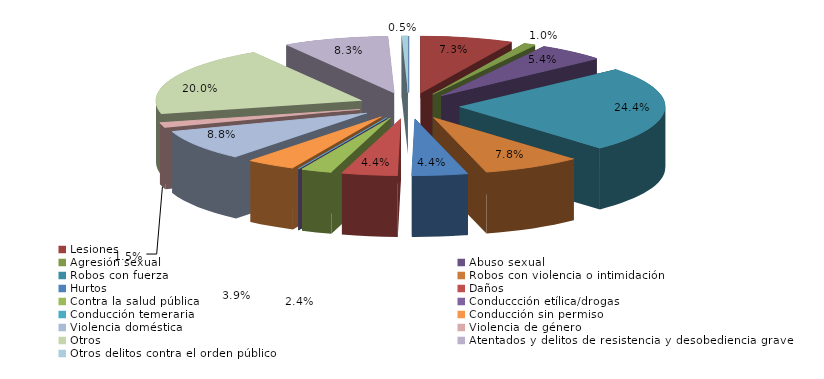
| Category | Series 0 |
|---|---|
| Homicidio/Asesinato dolosos | 0 |
| Lesiones | 15 |
| Agresión sexual | 2 |
| Abuso sexual | 11 |
| Robos con fuerza | 50 |
| Robos con violencia o intimidación | 16 |
| Hurtos | 9 |
| Daños | 9 |
| Contra la salud pública | 5 |
| Conduccción etílica/drogas | 0 |
| Conducción temeraria | 0 |
| Conducción sin permiso | 8 |
| Violencia doméstica | 18 |
| Violencia de género | 3 |
| Otros | 41 |
| Atentados y delitos de resistencia y desobediencia grave | 17 |
| Otros delitos contra el orden público | 1 |